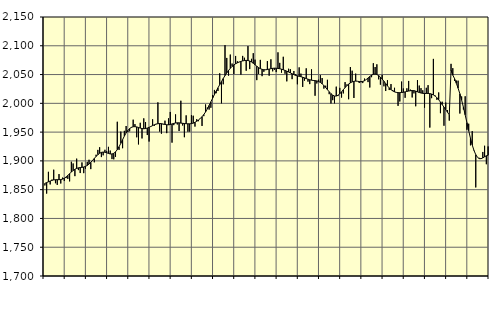
| Category | Piggar | Series 1 |
|---|---|---|
| nan | 1857.3 | 1860.96 |
| 1.0 | 1843.2 | 1862.29 |
| 1.0 | 1881 | 1863.7 |
| 1.0 | 1859.1 | 1865.03 |
| 1.0 | 1867.5 | 1866.13 |
| 1.0 | 1884.7 | 1866.98 |
| 1.0 | 1861.2 | 1867.26 |
| 1.0 | 1858.3 | 1867.4 |
| 1.0 | 1877.1 | 1867.34 |
| 1.0 | 1860.7 | 1867.57 |
| 1.0 | 1870.9 | 1868.35 |
| 1.0 | 1865 | 1869.82 |
| nan | 1870.1 | 1872.03 |
| 2.0 | 1868.7 | 1874.79 |
| 2.0 | 1864.4 | 1877.77 |
| 2.0 | 1898.5 | 1880.65 |
| 2.0 | 1895.5 | 1883.26 |
| 2.0 | 1873.5 | 1885.37 |
| 2.0 | 1903.9 | 1886.89 |
| 2.0 | 1884 | 1887.89 |
| 2.0 | 1878.9 | 1888.43 |
| 2.0 | 1897.3 | 1888.78 |
| 2.0 | 1878.7 | 1889.36 |
| 2.0 | 1886.3 | 1890.42 |
| nan | 1898.3 | 1892.15 |
| 3.0 | 1902 | 1894.54 |
| 3.0 | 1885.7 | 1897.49 |
| 3.0 | 1900.4 | 1900.83 |
| 3.0 | 1897.5 | 1904.29 |
| 3.0 | 1910.7 | 1907.7 |
| 3.0 | 1919.1 | 1910.79 |
| 3.0 | 1923.7 | 1913.23 |
| 3.0 | 1906.6 | 1914.75 |
| 3.0 | 1909.7 | 1915.34 |
| 3.0 | 1919.3 | 1915.04 |
| 3.0 | 1916.9 | 1914.11 |
| nan | 1924.4 | 1912.94 |
| 4.0 | 1917.9 | 1912.05 |
| 4.0 | 1903.1 | 1912 |
| 4.0 | 1902.7 | 1913.14 |
| 4.0 | 1907 | 1915.61 |
| 4.0 | 1968 | 1919.5 |
| 4.0 | 1919.1 | 1924.59 |
| 4.0 | 1950.9 | 1930.48 |
| 4.0 | 1922 | 1936.82 |
| 4.0 | 1952.2 | 1943.05 |
| 4.0 | 1960.6 | 1948.55 |
| 4.0 | 1950.2 | 1952.96 |
| nan | 1951.4 | 1956.22 |
| 5.0 | 1957.6 | 1958.31 |
| 5.0 | 1971.6 | 1959.31 |
| 5.0 | 1963.9 | 1959.47 |
| 5.0 | 1941 | 1959.03 |
| 5.0 | 1928.6 | 1958.08 |
| 5.0 | 1966.2 | 1957 |
| 5.0 | 1939 | 1956.19 |
| 5.0 | 1973.9 | 1955.86 |
| 5.0 | 1967.5 | 1956.17 |
| 5.0 | 1944.9 | 1957.04 |
| 5.0 | 1933.6 | 1958.33 |
| nan | 1959.5 | 1959.79 |
| 6.0 | 1972.3 | 1961.34 |
| 6.0 | 1960.9 | 1962.8 |
| 6.0 | 1964.3 | 1963.89 |
| 6.0 | 2001.7 | 1964.58 |
| 6.0 | 1950.9 | 1964.93 |
| 6.0 | 1947.2 | 1964.69 |
| 6.0 | 1963.3 | 1964.03 |
| 6.0 | 1969.9 | 1963.35 |
| 6.0 | 1948.2 | 1962.77 |
| 6.0 | 1973.9 | 1962.66 |
| 6.0 | 1985 | 1963.22 |
| nan | 1931.7 | 1964.2 |
| 7.0 | 1962.1 | 1965.14 |
| 7.0 | 1980.8 | 1965.85 |
| 7.0 | 1963.3 | 1966.19 |
| 7.0 | 1951.9 | 1966.1 |
| 7.0 | 2004.5 | 1965.67 |
| 7.0 | 1961.5 | 1965.27 |
| 7.0 | 1941.1 | 1964.96 |
| 7.0 | 1979.1 | 1964.66 |
| 7.0 | 1950.7 | 1964.42 |
| 7.0 | 1950.8 | 1964.42 |
| 7.0 | 1979.5 | 1964.75 |
| nan | 1978.5 | 1965.58 |
| 8.0 | 1959.6 | 1966.98 |
| 8.0 | 1972.5 | 1968.79 |
| 8.0 | 1969 | 1971.05 |
| 8.0 | 1974.2 | 1973.72 |
| 8.0 | 1960.7 | 1976.85 |
| 8.0 | 1977.7 | 1980.52 |
| 8.0 | 1998.1 | 1985.01 |
| 8.0 | 1992.7 | 1990.34 |
| 8.0 | 1989.2 | 1996.31 |
| 8.0 | 1992.3 | 2002.65 |
| 8.0 | 2014.6 | 2009 |
| nan | 2023.3 | 2015.2 |
| 9.0 | 2017.6 | 2021.16 |
| 9.0 | 2021.4 | 2026.9 |
| 9.0 | 2052.2 | 2032.4 |
| 9.0 | 2000 | 2037.83 |
| 9.0 | 2033.1 | 2043.13 |
| 9.0 | 2101.1 | 2048.18 |
| 9.0 | 2078.9 | 2052.91 |
| 9.0 | 2048.1 | 2057.1 |
| 9.0 | 2084.7 | 2060.83 |
| 9.0 | 2069.1 | 2064.1 |
| 9.0 | 2050.8 | 2066.76 |
| nan | 2082.3 | 2068.76 |
| 10.0 | 2073 | 2070.35 |
| 10.0 | 2072 | 2071.75 |
| 10.0 | 2049.8 | 2072.86 |
| 10.0 | 2082.4 | 2073.7 |
| 10.0 | 2079.2 | 2074.33 |
| 10.0 | 2056.6 | 2074.64 |
| 10.0 | 2099.5 | 2074.38 |
| 10.0 | 2059.5 | 2073.53 |
| 10.0 | 2077.3 | 2071.92 |
| 10.0 | 2087.1 | 2069.63 |
| 10.0 | 2075.9 | 2067.04 |
| nan | 2040.3 | 2064.45 |
| 11.0 | 2051.1 | 2062.1 |
| 11.0 | 2075.5 | 2060.23 |
| 11.0 | 2047.2 | 2059.03 |
| 11.0 | 2054.8 | 2058.43 |
| 11.0 | 2058 | 2058.32 |
| 11.0 | 2073.4 | 2058.74 |
| 11.0 | 2048 | 2059.48 |
| 11.0 | 2076.5 | 2060.2 |
| 11.0 | 2055.6 | 2060.82 |
| 11.0 | 2058.3 | 2061.09 |
| 11.0 | 2054.3 | 2060.96 |
| nan | 2088.6 | 2060.63 |
| 12.0 | 2070.3 | 2060.12 |
| 12.0 | 2053.3 | 2059.3 |
| 12.0 | 2080.9 | 2058.27 |
| 12.0 | 2051.4 | 2057.18 |
| 12.0 | 2038.2 | 2055.91 |
| 12.0 | 2060.1 | 2054.45 |
| 12.0 | 2059.3 | 2052.91 |
| 12.0 | 2042 | 2051.34 |
| 12.0 | 2056.2 | 2049.78 |
| 12.0 | 2050.6 | 2048.55 |
| 12.0 | 2033.1 | 2047.66 |
| nan | 2062.5 | 2046.99 |
| 13.0 | 2051.6 | 2046.27 |
| 13.0 | 2028.5 | 2045.34 |
| 13.0 | 2039.4 | 2044.24 |
| 13.0 | 2060.8 | 2043.06 |
| 13.0 | 2037.7 | 2041.95 |
| 13.0 | 2033.4 | 2040.99 |
| 13.0 | 2059.1 | 2040.25 |
| 13.0 | 2040.5 | 2039.75 |
| 13.0 | 2013.2 | 2039.45 |
| 13.0 | 2034.5 | 2038.94 |
| 13.0 | 2041.1 | 2038 |
| nan | 2049 | 2036.37 |
| 14.0 | 2044 | 2033.97 |
| 14.0 | 2025.6 | 2030.99 |
| 14.0 | 2030.6 | 2027.53 |
| 14.0 | 2040.9 | 2023.74 |
| 14.0 | 2015.9 | 2020.05 |
| 14.0 | 1999.8 | 2016.79 |
| 14.0 | 2005.5 | 2014.19 |
| 14.0 | 2000 | 2012.71 |
| 14.0 | 2029 | 2012.68 |
| 14.0 | 2012.6 | 2014.1 |
| 14.0 | 2026.9 | 2016.65 |
| nan | 2010 | 2019.96 |
| 15.0 | 2017.2 | 2023.64 |
| 15.0 | 2036.9 | 2027.32 |
| 15.0 | 2032.8 | 2030.66 |
| 15.0 | 2007.1 | 2033.42 |
| 15.0 | 2063.1 | 2035.59 |
| 15.0 | 2056.7 | 2037.24 |
| 15.0 | 2009.3 | 2038.27 |
| 15.0 | 2051.6 | 2038.62 |
| 15.0 | 2038.5 | 2038.36 |
| 15.0 | 2035.3 | 2037.85 |
| 15.0 | 2036.6 | 2037.65 |
| nan | 2035.2 | 2038.06 |
| 16.0 | 2043 | 2039.33 |
| 16.0 | 2041.3 | 2041.42 |
| 16.0 | 2036.9 | 2043.99 |
| 16.0 | 2027.5 | 2046.69 |
| 16.0 | 2045.4 | 2049.02 |
| 16.0 | 2069.7 | 2050.43 |
| 16.0 | 2063.1 | 2050.78 |
| 16.0 | 2067.8 | 2050.05 |
| 16.0 | 2041.7 | 2048.24 |
| 16.0 | 2032.4 | 2045.63 |
| 16.0 | 2049.6 | 2042.28 |
| nan | 2029.6 | 2038.39 |
| 17.0 | 2021.4 | 2034.3 |
| 17.0 | 2040.2 | 2030.34 |
| 17.0 | 2023.1 | 2026.76 |
| 17.0 | 2033.5 | 2023.78 |
| 17.0 | 2023.2 | 2021.54 |
| 17.0 | 2027 | 2019.95 |
| 17.0 | 2019.4 | 2019.02 |
| 17.0 | 1995.6 | 2018.59 |
| 17.0 | 2003.2 | 2018.53 |
| 17.0 | 2037.8 | 2018.78 |
| 17.0 | 2025.8 | 2019.23 |
| nan | 2009.6 | 2019.9 |
| 18.0 | 2026.1 | 2020.69 |
| 18.0 | 2038.9 | 2021.32 |
| 18.0 | 2023.8 | 2021.88 |
| 18.0 | 2010.2 | 2022.28 |
| 18.0 | 2017.3 | 2022.05 |
| 18.0 | 1994.9 | 2021.21 |
| 18.0 | 2040.3 | 2020.02 |
| 18.0 | 2030.9 | 2018.8 |
| 18.0 | 2026.4 | 2017.91 |
| 18.0 | 2022.7 | 2017.33 |
| 18.0 | 1992.4 | 2017.12 |
| nan | 2027 | 2017.17 |
| 19.0 | 2031.6 | 2017.2 |
| 19.0 | 1957.9 | 2016.92 |
| 19.0 | 2009 | 2016.11 |
| 19.0 | 2077.2 | 2014.66 |
| 19.0 | 2013.5 | 2012.57 |
| 19.0 | 2006.1 | 2009.79 |
| 19.0 | 2018.9 | 2006.27 |
| 19.0 | 1982.9 | 2002.17 |
| 19.0 | 2002.8 | 1997.78 |
| 19.0 | 1961.1 | 1993.34 |
| 19.0 | 2001.4 | 1988.87 |
| nan | 1988.2 | 1984.5 |
| 20.0 | 1970 | 1980.08 |
| 20.0 | 2068.6 | 2057.96 |
| 20.0 | 2061.1 | 2049.04 |
| 20.0 | 2038.8 | 2042.92 |
| 20.0 | 2039.6 | 2034.78 |
| 20.0 | 2039.4 | 2026.35 |
| 20.0 | 1982.3 | 2016.66 |
| 20.0 | 2011.9 | 2005.61 |
| 20.0 | 1989.3 | 1993.36 |
| 20.0 | 2012.3 | 1980.06 |
| 20.0 | 1954.1 | 1966.28 |
| nan | 1964.6 | 1952.47 |
| 21.0 | 1927 | 1939.39 |
| 21.0 | 1951.7 | 1927.76 |
| 21.0 | 1917.4 | 1918.1 |
| 21.0 | 1853.9 | 1910.83 |
| 21.0 | 1906.1 | 1906.16 |
| 21.0 | 1905.3 | 1903.94 |
| 21.0 | 1904.6 | 1903.83 |
| 21.0 | 1915.5 | 1905.22 |
| 21.0 | 1926.3 | 1907.16 |
| 21.0 | 1894.2 | 1908.91 |
| 21.0 | 1925.1 | 1909.84 |